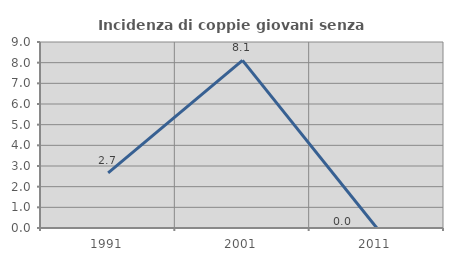
| Category | Incidenza di coppie giovani senza figli |
|---|---|
| 1991.0 | 2.667 |
| 2001.0 | 8.108 |
| 2011.0 | 0 |